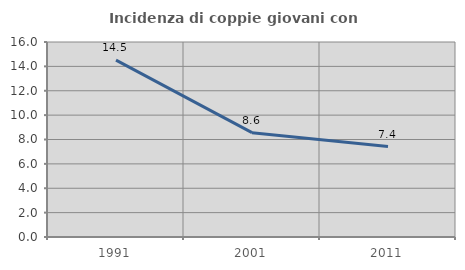
| Category | Incidenza di coppie giovani con figli |
|---|---|
| 1991.0 | 14.51 |
| 2001.0 | 8.56 |
| 2011.0 | 7.422 |